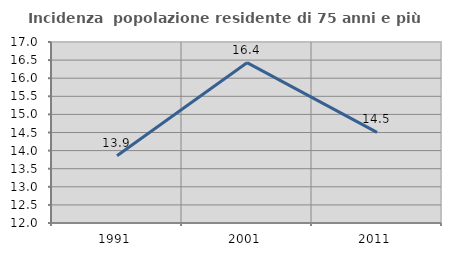
| Category | Incidenza  popolazione residente di 75 anni e più |
|---|---|
| 1991.0 | 13.855 |
| 2001.0 | 16.429 |
| 2011.0 | 14.504 |